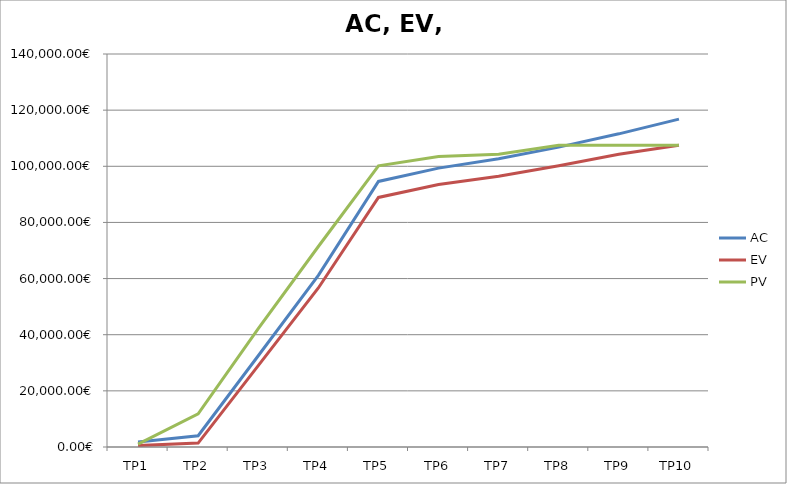
| Category | AC | EV | PV |
|---|---|---|---|
| TP1 | 1750 | 500 | 1000 |
| TP2 | 4000 | 1400 | 11823.529 |
| TP3 | 32500 | 29000 | 42129.412 |
| TP4 | 61175 | 56650 | 71423.529 |
| TP5 | 94600 | 88900 | 100166.667 |
| TP6 | 99350 | 93500 | 103500 |
| TP7 | 102690 | 96450 | 104293.269 |
| TP8 | 106830 | 100200 | 107500 |
| TP9 | 111560 | 104300 | 107500 |
| TP10 | 116800 | 107500 | 107500 |